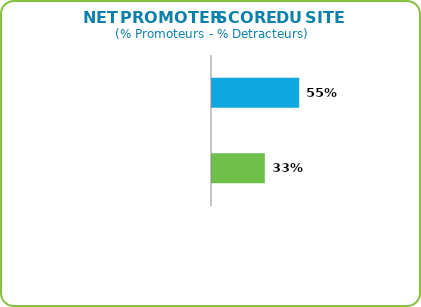
| Category | NPS (% PROMOTEURS - % DETRACTEURS) |
|---|---|
| LaTribuneAuto.com | 0.552 |
| Norme NetObserver France * | 0.334 |